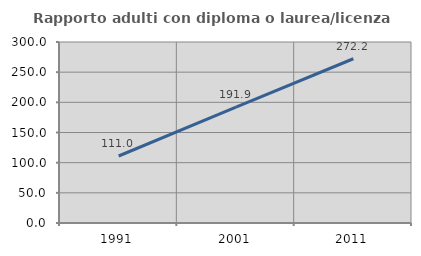
| Category | Rapporto adulti con diploma o laurea/licenza media  |
|---|---|
| 1991.0 | 111.05 |
| 2001.0 | 191.94 |
| 2011.0 | 272.248 |